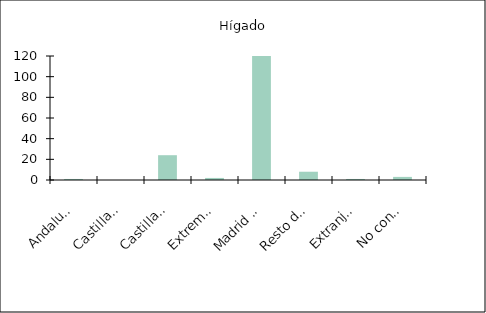
| Category | Hígado |
|---|---|
|    Andalucía | 1 |
|    Castilla y León | 0 |
|    Castilla-La Mancha | 24 |
|    Extremadura | 2 |
|    Madrid (Comunidad de) | 166 |
|    Resto de CCAA | 8 |
|    Extranjero | 1 |
|    No consta | 3 |